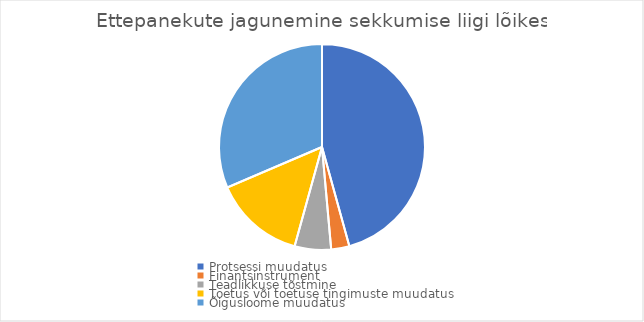
| Category | Ettepanekute jagunemine sekkumise liigi lõikes |
|---|---|
| Protsessi muudatus | 16 |
| Finantsinstrument | 1 |
| Teadlikkuse tõstmine | 2 |
| Toetus või toetuse tingimuste muudatus | 5 |
| Õigusloome muudatus | 11 |